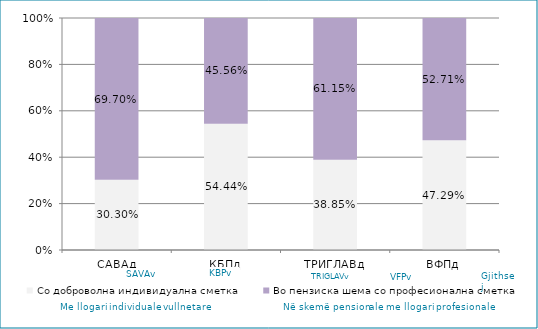
| Category | Со доброволна индивидуална сметка  | Во пензиска шема со професионална сметка |
|---|---|---|
| САВАд | 0.303 | 0.697 |
| КБПд | 0.544 | 0.456 |
| ТРИГЛАВд | 0.389 | 0.611 |
| ВФПд | 0.473 | 0.527 |